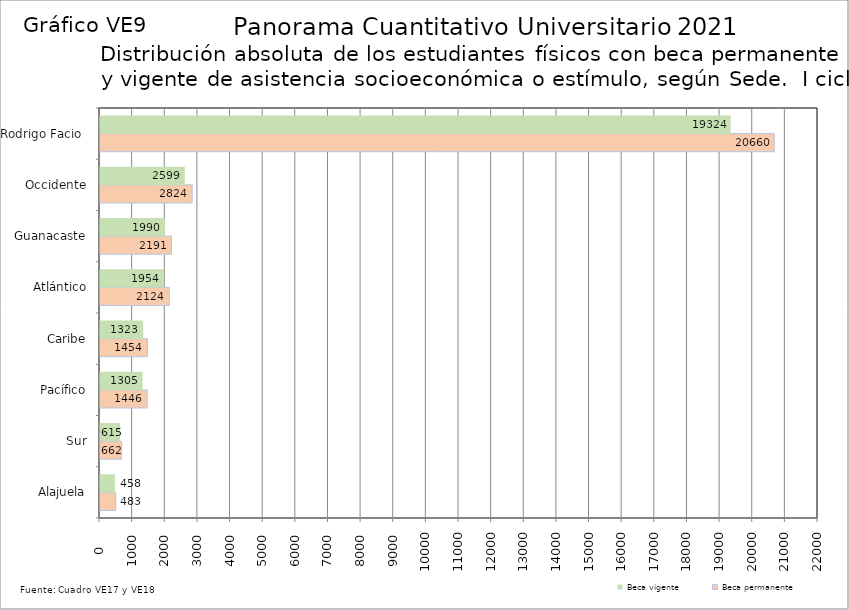
| Category | Beca permanente | Beca vigente |
|---|---|---|
| Alajuela | 483 | 458 |
| Sur | 662 | 615 |
| Pacífico | 1446 | 1305 |
| Caribe | 1454 | 1323 |
| Atlántico | 2124 | 1954 |
| Guanacaste | 2191 | 1990 |
| Occidente | 2824 | 2599 |
| Rodrigo Facio  | 20660 | 19324 |